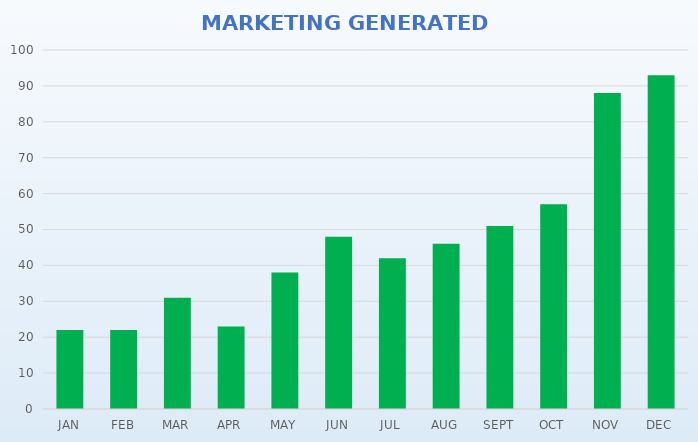
| Category | GRAND TOTAL |
|---|---|
| JAN | 22 |
| FEB | 22 |
| MAR | 31 |
| APR | 23 |
| MAY | 38 |
| JUN | 48 |
| JUL | 42 |
| AUG | 46 |
| SEPT | 51 |
| OCT | 57 |
| NOV | 88 |
| DEC | 93 |